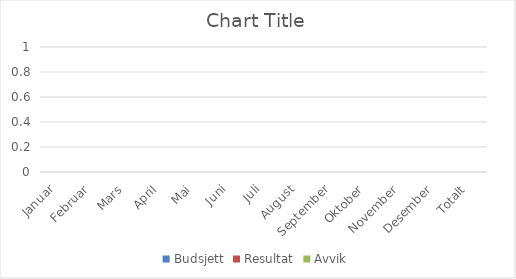
| Category | Budsjett | Resultat | Avvik |
|---|---|---|---|
| Januar | 0 | 0 | 0 |
| Februar | 0 | 0 | 0 |
| Mars | 0 | 0 | 0 |
| April | 0 | 0 | 0 |
| Mai | 0 | 0 | 0 |
| Juni | 0 | 0 | 0 |
| Juli | 0 | 0 | 0 |
| August | 0 | 0 | 0 |
| September | 0 | 0 | 0 |
| Oktober | 0 | 0 | 0 |
| November | 0 | 0 | 0 |
| Desember | 0 | 0 | 0 |
| Totalt | 0 | 0 | 0 |